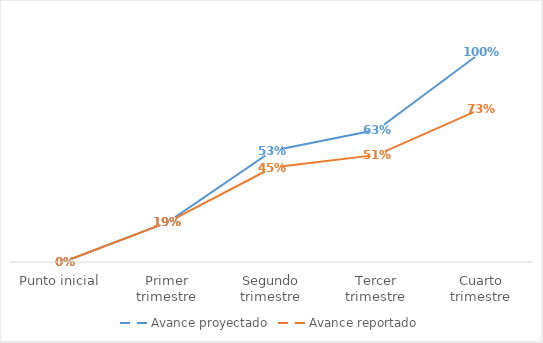
| Category | Avance proyectado | Avance reportado |
|---|---|---|
| Punto inicial | 0 | 0 |
| Primer trimestre | 0.19 | 0.19 |
| Segundo trimestre | 0.53 | 0.45 |
| Tercer trimestre | 0.63 | 0.51 |
| Cuarto trimestre | 1 | 0.73 |